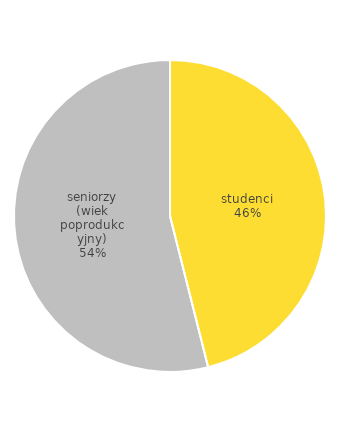
| Category | Series 0 |
|---|---|
| studenci | 110.346 |
| seniorzy (wiek poprodukcyjny) | 129.2 |